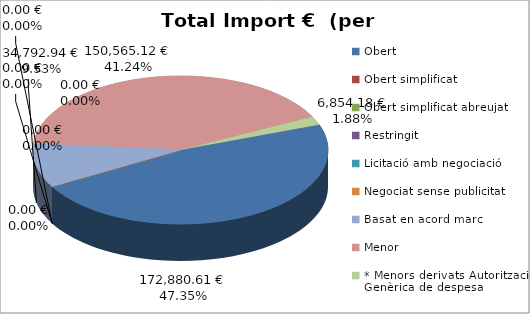
| Category | Total preu              (amb iva) |
|---|---|
| Obert | 172880.61 |
| Obert simplificat | 0 |
| Obert simplificat abreujat | 0 |
| Restringit | 0 |
| Licitació amb negociació | 0 |
| Negociat sense publicitat | 0 |
| Basat en acord marc | 34792.94 |
| Menor | 150565.12 |
| * Menors derivats Autorització Genèrica de despesa | 6854.18 |